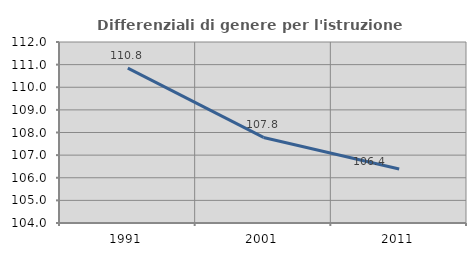
| Category | Differenziali di genere per l'istruzione superiore |
|---|---|
| 1991.0 | 110.842 |
| 2001.0 | 107.782 |
| 2011.0 | 106.388 |